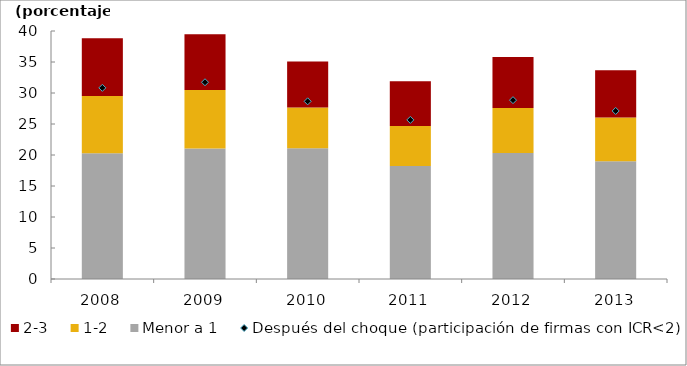
| Category | Menor a 1 | 1-2 | 2-3 |
|---|---|---|---|
| 2008.0 | 20.263 | 9.266 | 9.283 |
| 2009.0 | 21.057 | 9.415 | 9.004 |
| 2010.0 | 21.088 | 6.57 | 7.441 |
| 2011.0 | 18.231 | 6.441 | 7.209 |
| 2012.0 | 20.304 | 7.278 | 8.208 |
| 2013.0 | 19.012 | 7.021 | 7.642 |